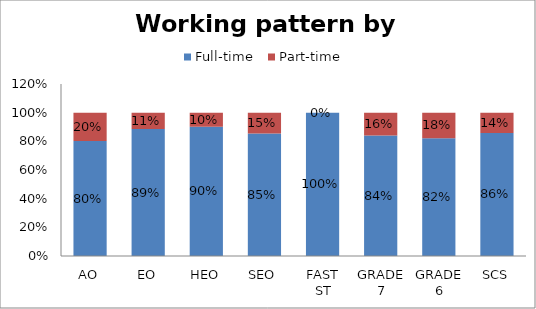
| Category | Full-time | Part-time |
|---|---|---|
| AO | 0.802 | 0.198 |
| EO | 0.885 | 0.115 |
| HEO | 0.901 | 0.099 |
| SEO | 0.854 | 0.146 |
| FAST ST | 1 | 0 |
| GRADE 7 | 0.84 | 0.16 |
| GRADE 6 | 0.822 | 0.178 |
| SCS | 0.859 | 0.141 |